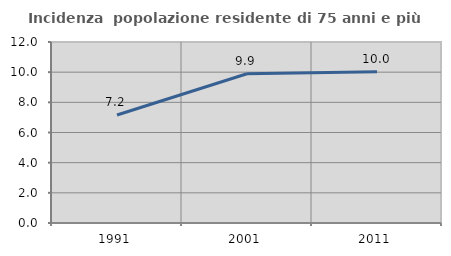
| Category | Incidenza  popolazione residente di 75 anni e più |
|---|---|
| 1991.0 | 7.16 |
| 2001.0 | 9.898 |
| 2011.0 | 10.033 |